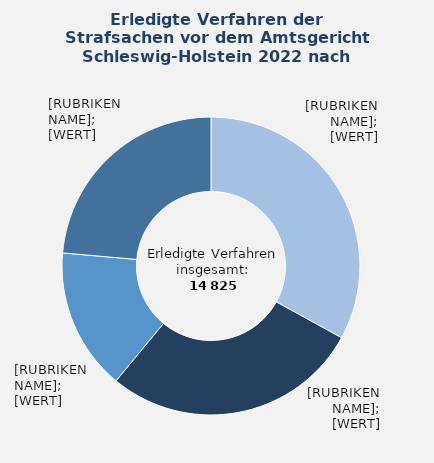
| Category | in Prozent |
|---|---|
| Eigentums- und Vermögensdelikte | 33 |
| Sonstige Straftaten | 28 |
| Verkehrsstraftaten | 15.4 |
| Übrige Sachgebiete¹ | 23.6 |